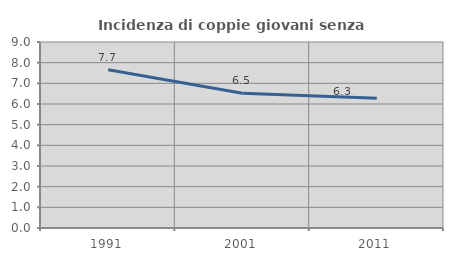
| Category | Incidenza di coppie giovani senza figli |
|---|---|
| 1991.0 | 7.658 |
| 2001.0 | 6.519 |
| 2011.0 | 6.275 |